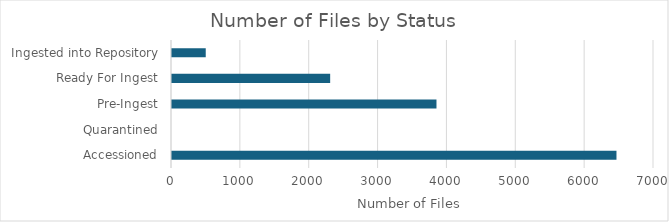
| Category | Number of Files |
|---|---|
| Accessioned | 6455 |
| Quarantined | 0 |
| Pre-Ingest | 3841 |
| Ready For Ingest | 2297 |
| Ingested into Repository | 490 |